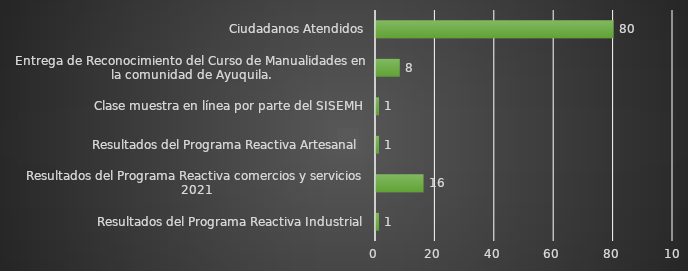
| Category | INDICADOR  |
|---|---|
| Resultados del Programa Reactiva Industrial | 1 |
| Resultados del Programa Reactiva comercios y servicios 2021 | 16 |
| Resultados del Programa Reactiva Artesanal  | 1 |
| Clase muestra en línea por parte del SISEMH | 1 |
| Entrega de Reconocimiento del Curso de Manualidades en la comunidad de Ayuquila. | 8 |
| Ciudadanos Atendidos | 80 |